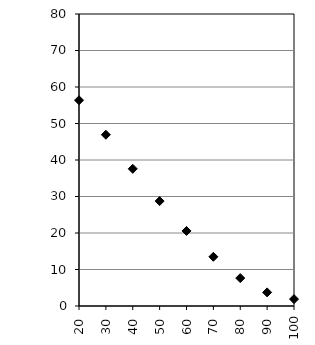
| Category | Series 0 |
|---|---|
| 0.0 | 75.67 |
| 10.0 | 66.126 |
| 20.0 | 56.369 |
| 30.0 | 46.918 |
| 40.0 | 37.583 |
| 50.0 | 28.743 |
| 60.0 | 20.563 |
| 70.0 | 13.481 |
| 80.0 | 7.654 |
| 90.0 | 3.729 |
| 100.0 | 1.892 |
| 101.0 | 1.683 |
| 102.0 | 1.341 |
| 103.0 | 1.033 |
| 104.0 | 0.5 |